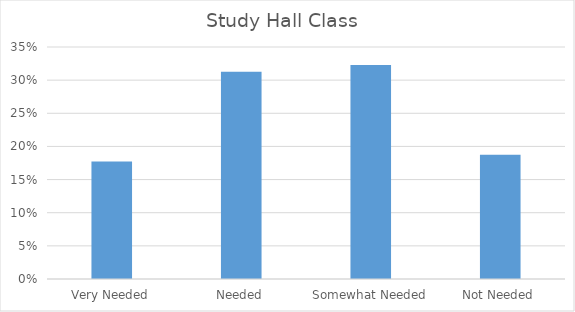
| Category | Study Hall Class  |
|---|---|
| Very Needed | 0.177 |
| Needed | 0.312 |
| Somewhat Needed | 0.323 |
| Not Needed | 0.188 |